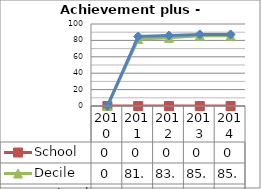
| Category | School  | Decile | National |
|---|---|---|---|
| 2010.0 | 0 | 0 | 0 |
| 2011.0 | 0 | 81.6 | 84.8 |
| 2012.0 | 0 | 83.1 | 85.9 |
| 2013.0 | 0 | 85.8 | 87.3 |
| 2014.0 | 0 | 85.8 | 87.3 |